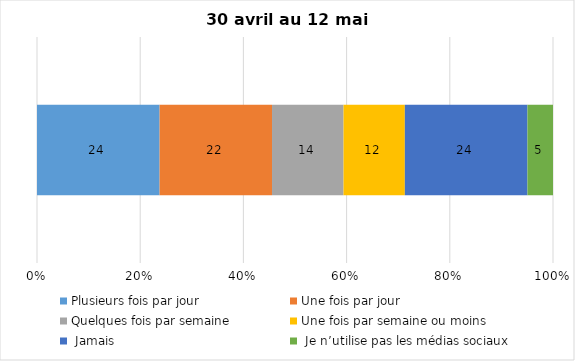
| Category | Plusieurs fois par jour | Une fois par jour | Quelques fois par semaine   | Une fois par semaine ou moins   |  Jamais   |  Je n’utilise pas les médias sociaux |
|---|---|---|---|---|---|---|
| 0 | 24 | 22 | 14 | 12 | 24 | 5 |